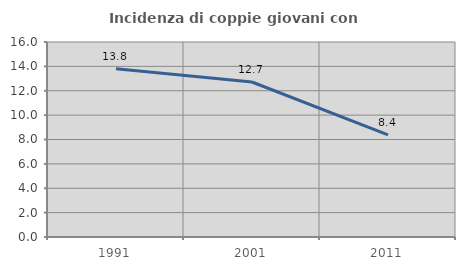
| Category | Incidenza di coppie giovani con figli |
|---|---|
| 1991.0 | 13.802 |
| 2001.0 | 12.719 |
| 2011.0 | 8.387 |